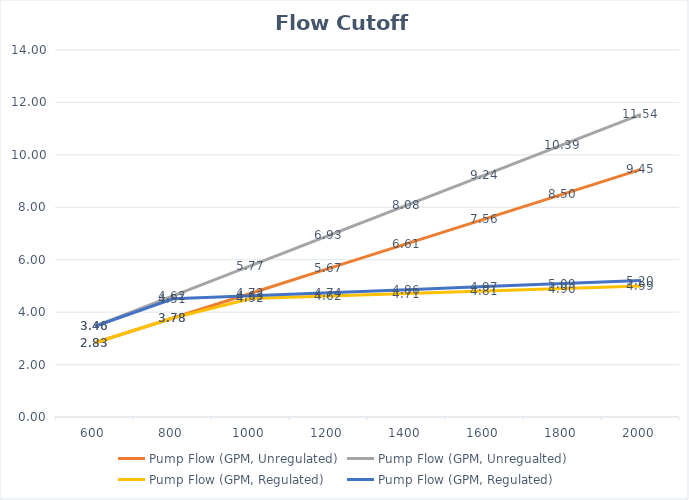
| Category | Pump Flow (GPM, Unregulated) | Pump Flow (GPM, Unregualted) | Pump Flow (GPM, Regulated) |
|---|---|---|---|
| 600.0 | 2.834 | 3.463 | 3.463 |
| 800.0 | 3.778 | 4.618 | 4.512 |
| 1000.0 | 4.723 | 5.772 | 4.627 |
| 1200.0 | 5.667 | 6.926 | 4.743 |
| 1400.0 | 6.612 | 8.081 | 4.858 |
| 1600.0 | 7.556 | 9.235 | 4.974 |
| 1800.0 | 8.501 | 10.39 | 5.089 |
| 2000.0 | 9.445 | 11.544 | 5.204 |